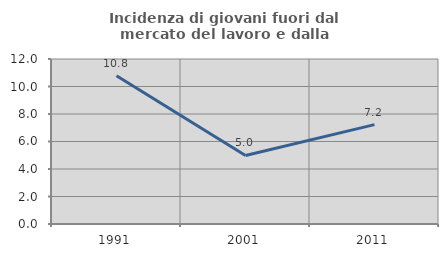
| Category | Incidenza di giovani fuori dal mercato del lavoro e dalla formazione  |
|---|---|
| 1991.0 | 10.776 |
| 2001.0 | 4.986 |
| 2011.0 | 7.225 |